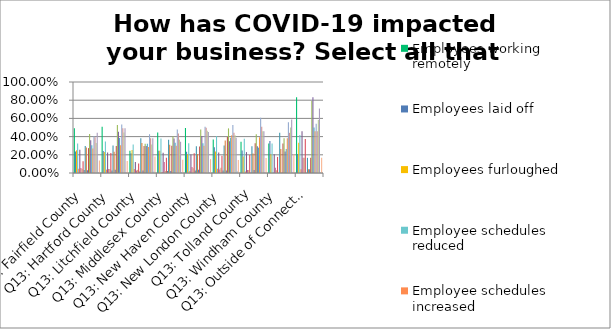
| Category | Employees working remotely | Employees laid off | Employees furloughed | Employee schedules reduced | Employee schedules increased | Reductions in salaries/wages | Recommending paid vacation usage during slower market time | Hiring employees | Regular hours of operation | Added hours of operation | Reduced hours of operation | Company is closed | Increased production/services | Reduced/limited products/services currently offered | Canceled meetings or conferences | Suspended or limited travel | Postponed decisions such as investments, R&D, capital, mergers, acquisitions, etc. | Disruptions in supply chain | Increased cleaning of work spaces | Added hand sanitizers and disinfecting cleaner throughout the office | Increased physical distance between workers | Restricted or no access to the office | Have not changed anything | Other (please specify) |
|---|---|---|---|---|---|---|---|---|---|---|---|---|---|---|---|---|---|---|---|---|---|---|---|---|
| Q13: Fairfield County | 0.492 | 0.238 | 0.249 | 0.325 | 0.048 | 0.254 | 0.055 | 0.045 | 0.128 | 0.033 | 0.297 | 0.28 | 0.031 | 0.273 | 0.43 | 0.361 | 0.304 | 0.268 | 0.404 | 0.392 | 0.33 | 0.442 | 0.005 | 0.138 |
| Q13: Hartford County | 0.507 | 0.241 | 0.23 | 0.346 | 0.037 | 0.227 | 0.045 | 0.045 | 0.221 | 0.028 | 0.303 | 0.232 | 0.037 | 0.298 | 0.527 | 0.453 | 0.385 | 0.306 | 0.533 | 0.493 | 0.445 | 0.493 | 0.003 | 0.133 |
| Q13: Litchfield County | 0.244 | 0.217 | 0.252 | 0.313 | 0.044 | 0.122 | 0.026 | 0.035 | 0.104 | 0.017 | 0.383 | 0.33 | 0.026 | 0.296 | 0.322 | 0.296 | 0.322 | 0.287 | 0.426 | 0.383 | 0.313 | 0.383 | 0.017 | 0.183 |
| Q13: Middlesex County | 0.444 | 0.244 | 0.244 | 0.378 | 0.011 | 0.222 | 0.122 | 0.022 | 0.167 | 0.022 | 0.367 | 0.311 | 0.022 | 0.3 | 0.4 | 0.378 | 0.333 | 0.3 | 0.478 | 0.433 | 0.367 | 0.344 | 0.011 | 0.144 |
| Q13: New Haven County | 0.495 | 0.233 | 0.205 | 0.326 | 0.023 | 0.202 | 0.065 | 0.052 | 0.218 | 0.028 | 0.295 | 0.21 | 0.036 | 0.29 | 0.477 | 0.407 | 0.326 | 0.3 | 0.508 | 0.497 | 0.464 | 0.451 | 0.003 | 0.153 |
| Q13: New London County | 0.368 | 0.283 | 0.236 | 0.406 | 0.047 | 0.226 | 0.038 | 0.057 | 0.189 | 0.028 | 0.302 | 0.358 | 0.028 | 0.396 | 0.491 | 0.349 | 0.387 | 0.415 | 0.528 | 0.443 | 0.415 | 0.387 | 0.019 | 0.142 |
| Q13: Tolland County | 0.344 | 0.246 | 0.18 | 0.377 | 0.016 | 0.23 | 0.033 | 0.033 | 0.197 | 0 | 0.295 | 0.213 | 0.033 | 0.328 | 0.426 | 0.295 | 0.279 | 0.393 | 0.607 | 0.508 | 0.459 | 0.459 | 0 | 0.164 |
| Q13: Windham County | 0.324 | 0.353 | 0.206 | 0.324 | 0 | 0.206 | 0.059 | 0.029 | 0.176 | 0 | 0.441 | 0.265 | 0 | 0.324 | 0.382 | 0.235 | 0.265 | 0.382 | 0.559 | 0.441 | 0.5 | 0.588 | 0 | 0.206 |
| Q13: Outside of Connecticut | 0.833 | 0.208 | 0.333 | 0.417 | 0.042 | 0.458 | 0.167 | 0.167 | 0.375 | 0 | 0.167 | 0.042 | 0.042 | 0.167 | 0.792 | 0.833 | 0.5 | 0.458 | 0.542 | 0.458 | 0.583 | 0.708 | 0 | 0.167 |